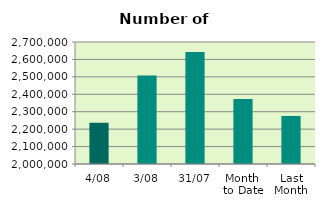
| Category | Series 0 |
|---|---|
| 4/08 | 2236626 |
| 3/08 | 2507924 |
| 31/07 | 2642678 |
| Month 
to Date | 2372275 |
| Last
Month | 2275631.565 |